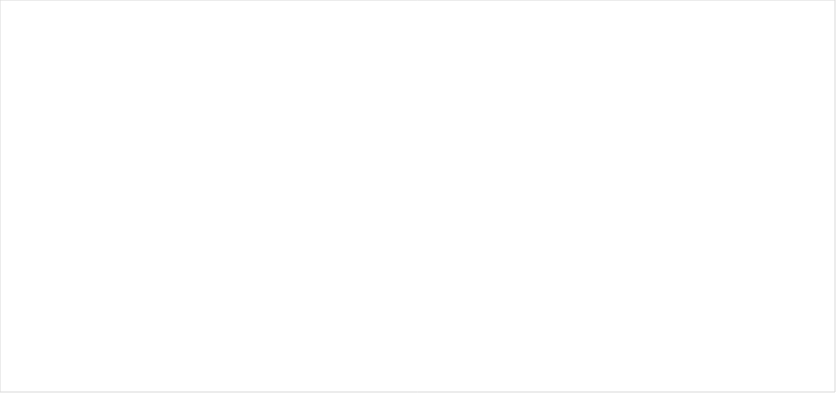
| Category | Som van Voorstel tot mediation aan wederpartij  | Som van RvR-geregistreerd |
|---|---|---|
| 2007 | 3372 | 1538 |
| 2008 | 4242 | 2349 |
| 2009 | 4564 | 2664 |
| 2010 | 3545 | 2271 |
| 2011 | 3777 | 2346 |
| 2012 | 3781 | 2552 |
| 2013 | 3768 | 2721 |
| 2014 | 3695 | 2768 |
| 2015 | 2537 | 1948 |
| 2016 | 2174 | 1658 |
| 2017 | 2057 | 1576 |
| 2018 | 1874 | 1362 |
| 2019 | 1403 | 1014 |